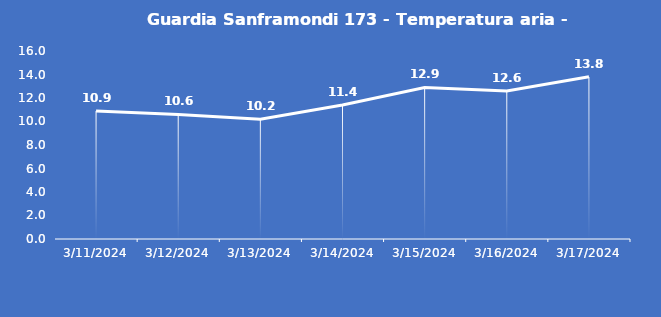
| Category | Guardia Sanframondi 173 - Temperatura aria - Grezzo (°C) |
|---|---|
| 3/11/24 | 10.9 |
| 3/12/24 | 10.6 |
| 3/13/24 | 10.2 |
| 3/14/24 | 11.4 |
| 3/15/24 | 12.9 |
| 3/16/24 | 12.6 |
| 3/17/24 | 13.8 |